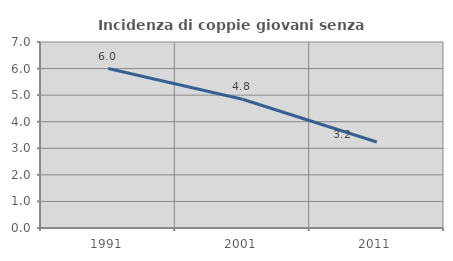
| Category | Incidenza di coppie giovani senza figli |
|---|---|
| 1991.0 | 6 |
| 2001.0 | 4.845 |
| 2011.0 | 3.238 |